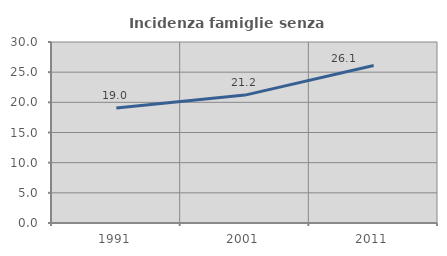
| Category | Incidenza famiglie senza nuclei |
|---|---|
| 1991.0 | 19.049 |
| 2001.0 | 21.197 |
| 2011.0 | 26.111 |